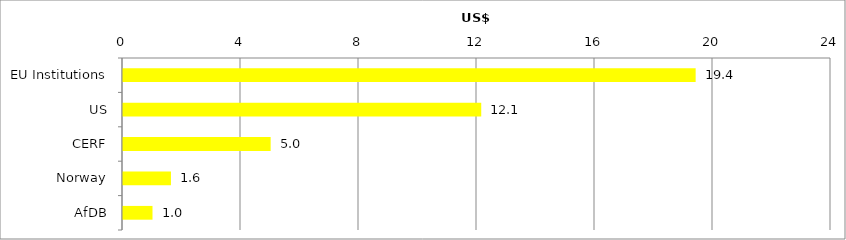
| Category | US$ (millions) |
|---|---|
| EU Institutions | 19.412 |
| US | 12.144 |
| CERF | 5.005 |
| Norway | 1.625 |
| AfDB | 1 |